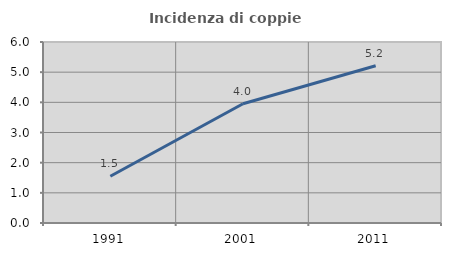
| Category | Incidenza di coppie miste |
|---|---|
| 1991.0 | 1.548 |
| 2001.0 | 3.954 |
| 2011.0 | 5.212 |